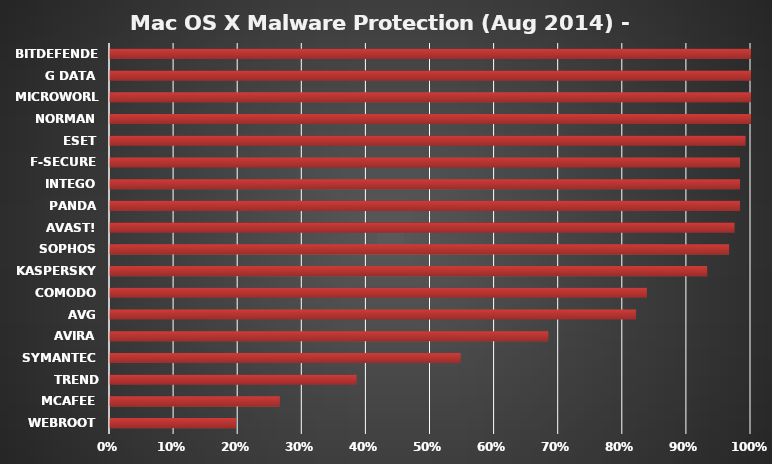
| Category | Series 0 |
|---|---|
| Webroot | 0.197 |
| McAfee | 0.265 |
| Trend Micro | 0.385 |
| Symantec | 0.547 |
| Avira | 0.684 |
| AVG | 0.821 |
| Comodo | 0.838 |
| Kaspersky | 0.932 |
| Sophos | 0.966 |
| avast! | 0.974 |
| Panda | 0.983 |
| Intego | 0.983 |
| F-Secure | 0.983 |
| ESET | 0.991 |
| Norman | 1 |
| Microworld | 1 |
| G Data | 1 |
| Bitdefender | 1 |